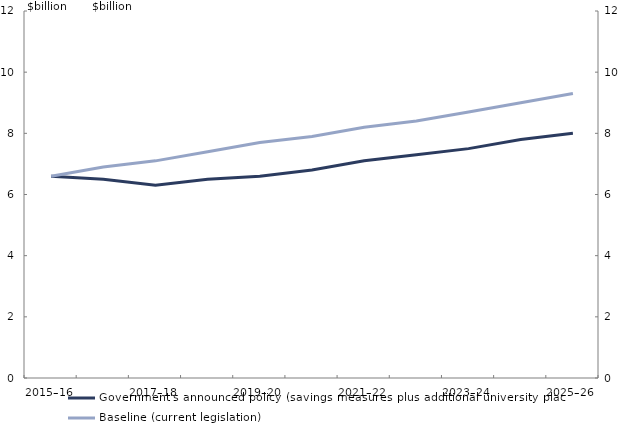
| Category | Government's announced policy (savings measures plus additional university places) |
|---|---|
| 2015–16 | 6.6 |
| 2016–17 | 6.5 |
| 2017–18 | 6.3 |
| 2018–19 | 6.5 |
| 2019–20 | 6.6 |
| 2020–21 | 6.8 |
| 2021–22 | 7.1 |
| 2022–23 | 7.3 |
| 2023–24 | 7.5 |
| 2024–25 | 7.8 |
| 2025–26 | 8 |